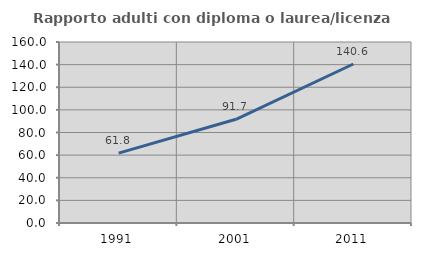
| Category | Rapporto adulti con diploma o laurea/licenza media  |
|---|---|
| 1991.0 | 61.775 |
| 2001.0 | 91.691 |
| 2011.0 | 140.557 |